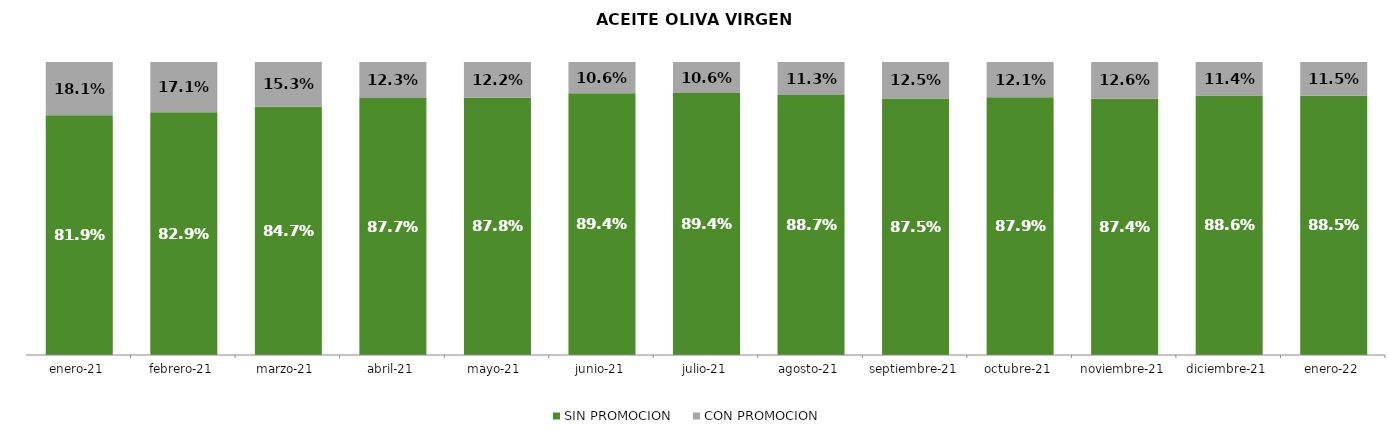
| Category | SIN PROMOCION   | CON PROMOCION   |
|---|---|---|
| 2021-01-01 | 0.819 | 0.181 |
| 2021-02-01 | 0.829 | 0.171 |
| 2021-03-01 | 0.847 | 0.153 |
| 2021-04-01 | 0.877 | 0.123 |
| 2021-05-01 | 0.878 | 0.122 |
| 2021-06-01 | 0.894 | 0.106 |
| 2021-07-01 | 0.894 | 0.106 |
| 2021-08-01 | 0.887 | 0.113 |
| 2021-09-01 | 0.875 | 0.125 |
| 2021-10-01 | 0.879 | 0.121 |
| 2021-11-01 | 0.874 | 0.126 |
| 2021-12-01 | 0.886 | 0.114 |
| 2022-01-01 | 0.885 | 0.115 |